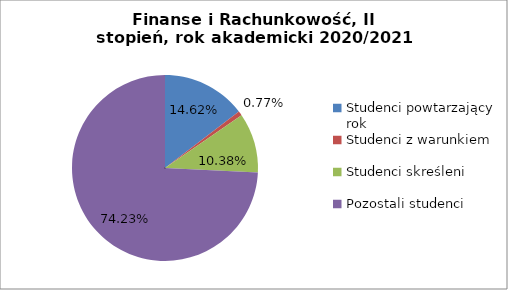
| Category | Series 0 |
|---|---|
| Studenci powtarzający rok | 38 |
| Studenci z warunkiem | 2 |
| Studenci skreśleni | 27 |
| Pozostali studenci | 193 |